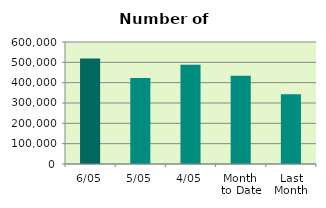
| Category | Series 0 |
|---|---|
| 6/05 | 518788 |
| 5/05 | 423232 |
| 4/05 | 488286 |
| Month 
to Date | 434067.5 |
| Last
Month | 343067.2 |